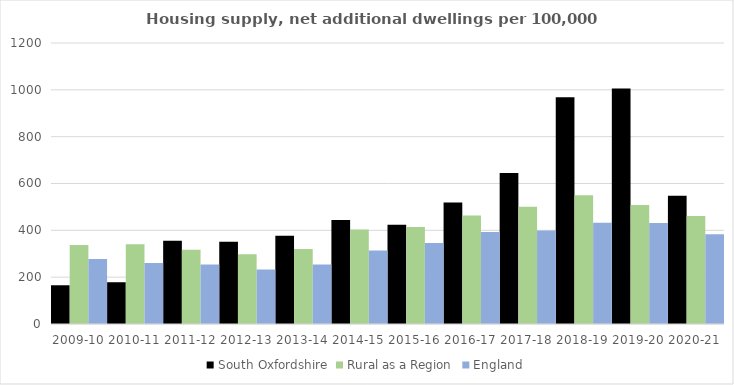
| Category | South Oxfordshire | Rural as a Region | England |
|---|---|---|---|
| 2009-10 | 165.435 | 337.852 | 277.548 |
| 2010-11 | 178.322 | 340.105 | 260.994 |
| 2011-12 | 355.658 | 317.04 | 254.007 |
| 2012-13 | 350.717 | 297.763 | 233.153 |
| 2013-14 | 377.032 | 319.835 | 253.602 |
| 2014-15 | 444.438 | 403.796 | 314.256 |
| 2015-16 | 423.37 | 414.091 | 346.154 |
| 2016-17 | 518.842 | 463.209 | 393.256 |
| 2017-18 | 644.644 | 500.68 | 399.646 |
| 2018-19 | 968.656 | 549.491 | 432.099 |
| 2019-20 | 1005.934 | 508.493 | 431.187 |
| 2020-21 | 548.052 | 461.114 | 382.827 |